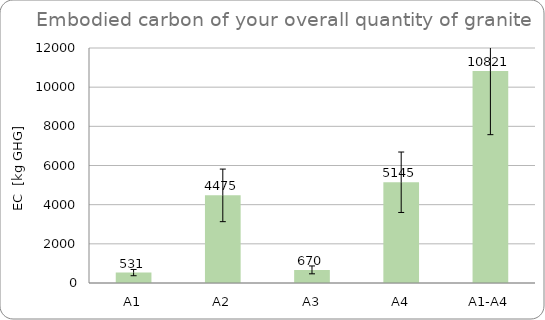
| Category | Series 0 |
|---|---|
| A1 | 531 |
| A2 | 4474.5 |
| A3 | 670 |
| A4 | 5145 |
| A1-A4 | 10820.5 |